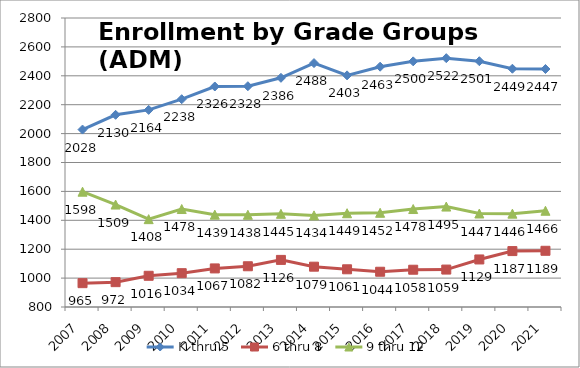
| Category | K thru 5 | 6 thru 8 | 9 thru 12 |
|---|---|---|---|
| 2007.0 | 2028 | 965 | 1598 |
| 2008.0 | 2130 | 972 | 1509 |
| 2009.0 | 2164 | 1016 | 1408 |
| 2010.0 | 2238 | 1034 | 1478 |
| 2011.0 | 2326 | 1067 | 1439 |
| 2012.0 | 2328 | 1082 | 1438 |
| 2013.0 | 2386 | 1126 | 1445 |
| 2014.0 | 2488 | 1079 | 1434 |
| 2015.0 | 2403 | 1061 | 1449 |
| 2016.0 | 2463 | 1044 | 1452 |
| 2017.0 | 2500 | 1058 | 1478 |
| 2018.0 | 2522 | 1059 | 1495 |
| 2019.0 | 2501 | 1129 | 1447 |
| 2020.0 | 2449 | 1187 | 1446 |
| 2021.0 | 2447 | 1189 | 1466 |